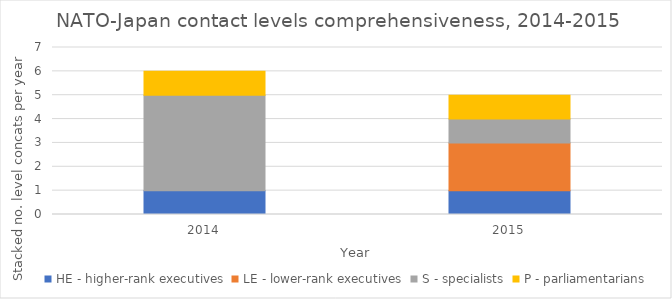
| Category | HE - higher-rank executives | LE - lower-rank executives | S - specialists | P - parliamentarians |
|---|---|---|---|---|
| 2014.0 | 1 | 0 | 4 | 1 |
| 2015.0 | 1 | 2 | 1 | 1 |